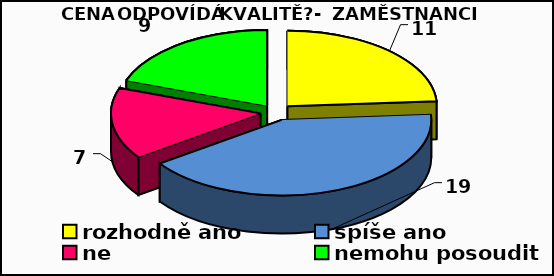
| Category | Series 0 |
|---|---|
| rozhodně ano | 11 |
| spíše ano | 19 |
| ne | 7 |
| nemohu posoudit | 9 |